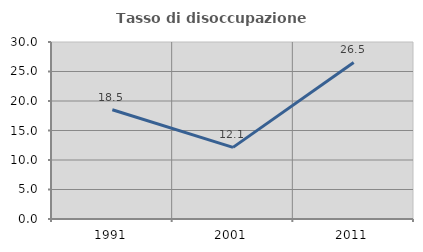
| Category | Tasso di disoccupazione giovanile  |
|---|---|
| 1991.0 | 18.514 |
| 2001.0 | 12.141 |
| 2011.0 | 26.531 |